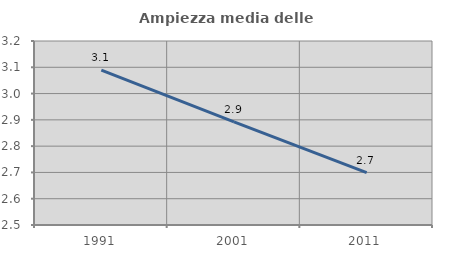
| Category | Ampiezza media delle famiglie |
|---|---|
| 1991.0 | 3.089 |
| 2001.0 | 2.893 |
| 2011.0 | 2.699 |